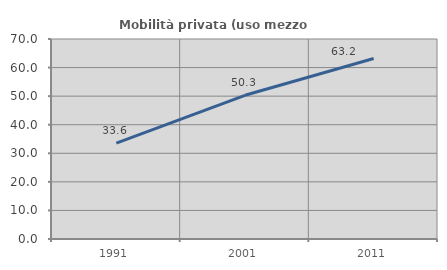
| Category | Mobilità privata (uso mezzo privato) |
|---|---|
| 1991.0 | 33.555 |
| 2001.0 | 50.291 |
| 2011.0 | 63.197 |